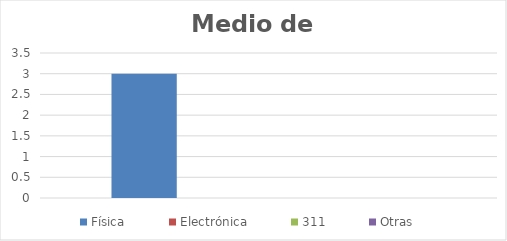
| Category | Física | Electrónica | 311 | Otras |
|---|---|---|---|---|
| 0 | 3 | 0 | 0 | 0 |